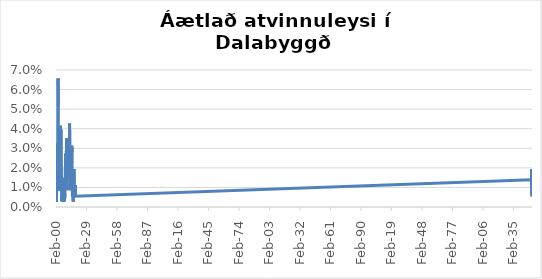
| Category | Series 0 |
|---|---|
| 2000-02-01 | 0.03 |
| 2000-03-01 | 0.027 |
| 2000-04-01 | 0.024 |
| 2000-05-01 | 0.011 |
| 2000-06-01 | 0.005 |
| 2000-07-01 | 0.003 |
| 2000-08-01 | 0.005 |
| 2000-09-01 | 0.005 |
| 2000-10-01 | 0.011 |
| 2000-11-01 | 0.019 |
| 2000-12-01 | 0.027 |
| 2001-01-01 | 0.027 |
| 2001-02-01 | 0.032 |
| 2001-03-01 | 0.032 |
| 2001-04-01 | 0.032 |
| 2001-05-01 | 0.024 |
| 2001-06-01 | 0.019 |
| 2001-07-01 | 0.026 |
| 2001-08-01 | 0.02 |
| 2001-09-01 | 0.014 |
| 2001-10-01 | 0.02 |
| 2001-11-01 | 0.043 |
| 2001-12-01 | 0.048 |
| 2002-01-01 | 0.063 |
| 2002-02-01 | 0.066 |
| 2002-03-01 | 0.051 |
| 2002-04-01 | 0.051 |
| 2002-05-01 | 0.017 |
| 2002-07-01 | 0.011 |
| 2002-08-01 | 0.017 |
| 2002-09-01 | 0.023 |
| 2002-10-01 | 0.037 |
| 2002-11-01 | 0.037 |
| 2002-12-01 | 0.04 |
| 2003-01-01 | 0.032 |
| 2003-02-01 | 0.038 |
| 2003-03-01 | 0.038 |
| 2003-04-01 | 0.037 |
| 2003-05-01 | 0.025 |
| 2003-06-01 | 0.02 |
| 2003-07-01 | 0.008 |
| 2003-08-01 | 0.014 |
| 2003-09-01 | 0.008 |
| 2003-10-01 | 0.033 |
| 2003-11-01 | 0.036 |
| 2003-12-01 | 0.041 |
| 2004-01-01 | 0.033 |
| 2004-02-01 | 0.039 |
| 2004-03-01 | 0.036 |
| 2004-04-01 | 0.042 |
| 2004-05-01 | 0.039 |
| 2004-06-01 | 0.033 |
| 2004-07-01 | 0.018 |
| 2004-08-01 | 0.009 |
| 2004-09-01 | 0.024 |
| 2004-10-01 | 0.04 |
| 2004-11-01 | 0.018 |
| 2004-12-01 | 0.021 |
| 2005-01-01 | 0.015 |
| 2005-02-01 | 0.012 |
| 2005-03-01 | 0.012 |
| 2005-04-01 | 0.012 |
| 2005-05-01 | 0.015 |
| 2005-06-01 | 0.009 |
| 2005-07-01 | 0.003 |
| 2005-08-01 | 0.003 |
| 2005-09-01 | 0.006 |
| 2005-10-01 | 0.006 |
| 2005-11-01 | 0.009 |
| 2005-12-01 | 0.012 |
| 2006-01-01 | 0.009 |
| 2006-02-01 | 0.009 |
| 2006-03-01 | 0.015 |
| 2006-04-01 | 0.014 |
| 2006-05-01 | 0.009 |
| 2006-06-01 | 0.005 |
| 2006-07-01 | 0.008 |
| 2006-08-01 | 0.005 |
| 2006-09-01 | 0.003 |
| 2006-10-01 | 0.003 |
| 2006-11-01 | 0.003 |
| 2006-12-01 | 0.003 |
| 2007-01-01 | 0.003 |
| 2007-02-01 | 0.006 |
| 2007-03-01 | 0.006 |
| 2007-04-01 | 0.008 |
| 2007-05-01 | 0.008 |
| 2007-06-01 | 0.005 |
| 2007-07-01 | 0.005 |
| 2007-08-01 | 0.005 |
| 2007-10-01 | 0.003 |
| 2007-11-01 | 0.003 |
| 2007-12-01 | 0.003 |
| 2008-04-01 | 0.003 |
| 2008-05-01 | 0.003 |
| 2008-06-01 | 0.003 |
| 2008-07-01 | 0.003 |
| 2008-08-01 | 0.005 |
| 2008-09-01 | 0.008 |
| 2008-10-01 | 0.008 |
| 2008-11-01 | 0.011 |
| 2008-12-01 | 0.014 |
| 2009-01-01 | 0.02 |
| 2009-02-01 | 0.021 |
| 2009-03-01 | 0.027 |
| 2009-04-01 | 0.02 |
| 2009-05-01 | 0.025 |
| 2009-06-01 | 0.025 |
| 2009-07-01 | 0.022 |
| 2009-08-01 | 0.022 |
| 2009-09-01 | 0.017 |
| 2009-10-01 | 0.017 |
| 2009-11-01 | 0.02 |
| 2009-12-01 | 0.023 |
| 2010-01-01 | 0.035 |
| 2010-02-01 | 0.033 |
| 2010-03-01 | 0.024 |
| 2010-04-01 | 0.028 |
| 2010-05-01 | 0.017 |
| 2010-06-01 | 0.014 |
| 2010-07-01 | 0.009 |
| 2010-08-01 | 0.011 |
| 2010-09-01 | 0.02 |
| 2010-10-01 | 0.02 |
| 2010-11-01 | 0.015 |
| 2010-12-01 | 0.02 |
| 2011-01-01 | 0.027 |
| 2011-02-01 | 0.033 |
| 2011-03-01 | 0.033 |
| 2011-04-01 | 0.026 |
| 2011-05-01 | 0.026 |
| 2011-06-01 | 0.023 |
| 2011-07-01 | 0.026 |
| 2011-08-01 | 0.029 |
| 2011-09-01 | 0.026 |
| 2011-10-01 | 0.018 |
| 2011-11-01 | 0.024 |
| 2011-12-01 | 0.024 |
| 2012-01-01 | 0.03 |
| 2012-02-01 | 0.028 |
| 2012-03-01 | 0.028 |
| 2012-04-01 | 0.024 |
| 2012-05-01 | 0.024 |
| 2012-06-01 | 0.018 |
| 2012-07-01 | 0.021 |
| 2012-08-01 | 0.021 |
| 2012-09-01 | 0.018 |
| 2012-10-01 | 0.025 |
| 2012-11-01 | 0.031 |
| 2012-12-01 | 0.04 |
| 2013-01-01 | 0.043 |
| 2013-02-01 | 0.042 |
| 2013-03-01 | 0.03 |
| 2013-04-01 | 0.028 |
| 2013-05-01 | 0.02 |
| 2013-06-01 | 0.017 |
| 2013-07-01 | 0.011 |
| 2013-08-01 | 0.009 |
| 2013-09-01 | 0.009 |
| 2013-10-01 | 0.009 |
| 2013-11-01 | 0.018 |
| 2013-12-01 | 0.024 |
| 2014-01-01 | 0.027 |
| 2014-02-01 | 0.021 |
| 2014-03-01 | 0.018 |
| 2014-04-01 | 0.017 |
| 2014-05-01 | 0.014 |
| 2014-06-01 | 0.014 |
| 2014-07-01 | 0.017 |
| 2014-08-01 | 0.014 |
| 2014-09-01 | 0.011 |
| 2014-10-01 | 0.011 |
| 2014-11-01 | 0.011 |
| 2014-12-01 | 0.02 |
| 2015-01-01 | 0.026 |
| 2015-02-01 | 0.028 |
| 2015-03-01 | 0.031 |
| 2015-04-01 | 0.028 |
| 2015-05-01 | 0.022 |
| 2015-06-01 | 0.022 |
| 2015-07-01 | 0.016 |
| 2015-08-01 | 0.014 |
| 2015-09-01 | 0.005 |
| 2015-10-01 | 0.008 |
| 2015-11-01 | 0.006 |
| 2015-12-01 | 0.008 |
| 2016-01-01 | 0.011 |
| 2016-02-01 | 0.008 |
| 2016-03-01 | 0.008 |
| 2016-04-01 | 0.008 |
| 2016-05-01 | 0.008 |
| 2016-06-01 | 0.003 |
| 2016-07-01 | 0.005 |
| 2016-08-01 | 0.008 |
| 2016-09-01 | 0.011 |
| 2016-10-01 | 0.014 |
| 2016-11-01 | 0.014 |
| 2016-12-01 | 0.011 |
| 2017-01-01 | 0.017 |
| 2017-02-01 | 0.017 |
| 2017-03-01 | 0.019 |
| 2017-04-01 | 0.019 |
| 2017-05-01 | 0.017 |
| 2017-06-01 | 0.011 |
| 2017-07-01 | 0.011 |
| 2017-08-01 | 0.008 |
| 2017-09-01 | 0.006 |
| 2017-10-01 | 0.006 |
| 2017-11-01 | 0.008 |
| 2017-12-01 | 0.008 |
| 2018-01-01 | 0.011 |
| 2018-02-01 | 0.006 |
| 2018-03-01 | 0.006 |
| 2018-04-01 | 0.006 |
| 2018-05-01 | 0.008 |
| 2018-06-01 | 0.011 |
| 2018-07-01 | 0.006 |
| 201808.0 | 0.014 |
| 201809.0 | 0.011 |
| 201810.0 | 0.017 |
| 201811.0 | 0.019 |
| 201812.0 | 0.011 |
| 201901.0 | 0.014 |
| 201902.0 | 0.014 |
| 201903.0 | 0.017 |
| 201904.0 | 0.017 |
| 201905.0 | 0.017 |
| 201906.0 | 0.017 |
| 201907.0 | 0.014 |
| 201908.0 | 0.017 |
| 201909.0 | 0.006 |
| 201910.0 | 0.011 |
| 201911.0 | 0.014 |